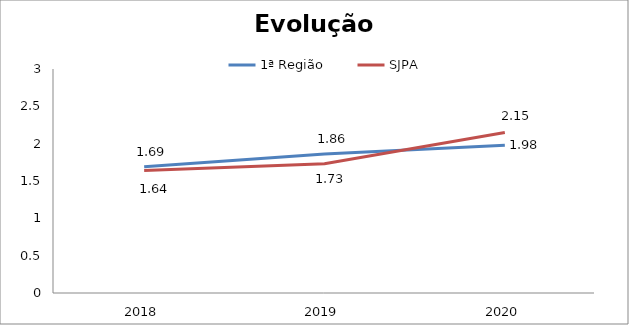
| Category | 1ª Região | SJPA |
|---|---|---|
| 0 | 1.69 | 1.64 |
| 1 | 1.86 | 1.73 |
| 2 | 1.98 | 2.15 |